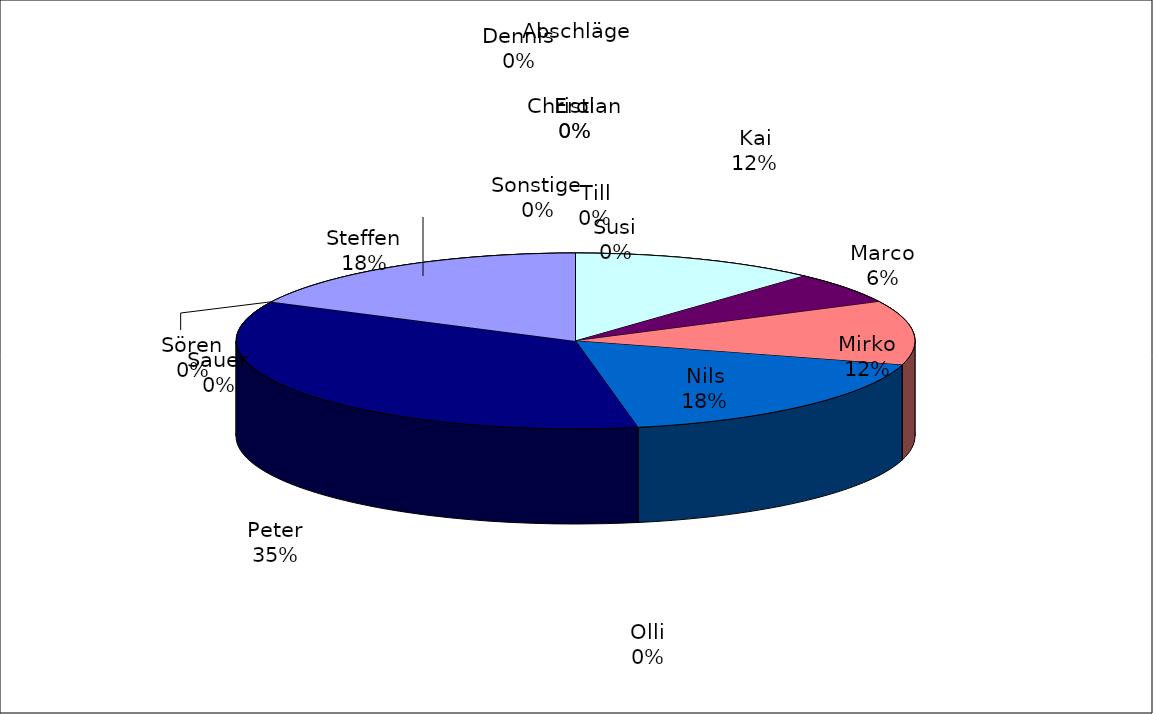
| Category | Series 0 |
|---|---|
| Christian | 0 |
| Dennis | 0 |
| Erol | 0 |
| Kai | 2 |
| Marco | 1 |
| Mirko | 2 |
| Nils | 3 |
| Olli | 0 |
| Peter | 6 |
| Sauer | 0 |
| Sören | 0 |
| Steffen | 3 |
| Susi | 0 |
| Till | 0 |
| Sonstige | 0 |